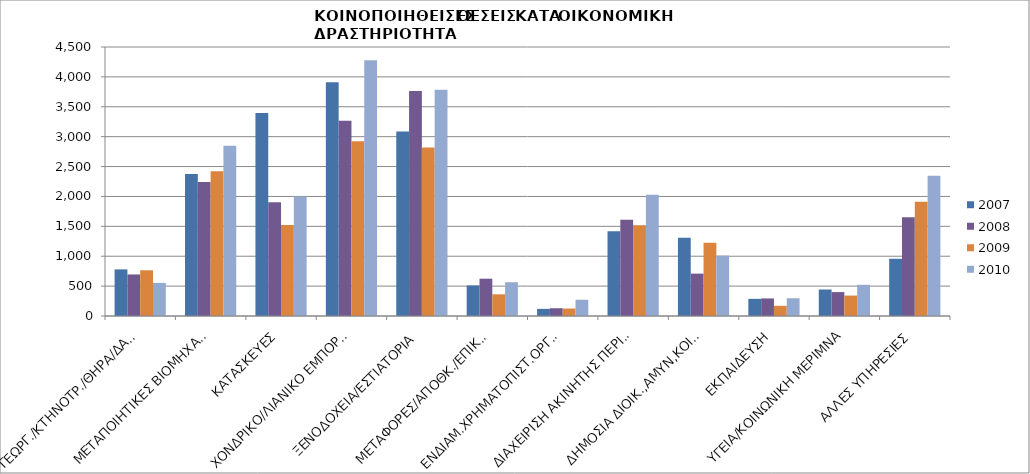
| Category | 2007 | 2008 | 2009 | 2010 |
|---|---|---|---|---|
| ΓΕΩΡΓ./ΚΤΗΝΟΤΡ./ΘΗΡΑ/ΔΑΣΟ | 780 | 695 | 765 | 554 |
| ΜΕΤΑΠΟΙΗΤΙΚΕΣ ΒΙΟΜΗΧΑΝΙΕΣ | 2376 | 2241 | 2423 | 2846 |
| ΚΑΤΑΣΚΕΥΕΣ | 3395 | 1903 | 1523 | 1999 |
| ΧΟΝΔΡΙΚΟ/ΛΙΑΝΙΚΟ ΕΜΠΟΡΙΟ | 3909 | 3267 | 2923 | 4277 |
| ΞΕΝΟΔΟΧΕΙΑ/ΕΣΤΙΑΤΟΡΙΑ | 3088 | 3762 | 2817 | 3785 |
| ΜΕΤΑΦΟΡΕΣ/ΑΠΟΘΚ./ΕΠΙΚΟΙΝ. | 511 | 624 | 363 | 565 |
| ΕΝΔΙΑΜ.ΧΡΗΜΑΤΟΠΙΣΤ.ΟΡΓΑΝ. | 119 | 130 | 125 | 272 |
| ΔΙΑΧΕΙΡΙΣΗ ΑΚΙΝΗΤΗΣ ΠΕΡΙΟΥΣ. | 1419 | 1609 | 1517 | 2030 |
| ΔΗΜΟΣΙΑ ΔΙΟΙΚ.,ΑΜΥΝ,ΚΟΙΝ.ΑΣΦ | 1311 | 709 | 1226 | 1010 |
| ΕΚΠΑΙΔΕΥΣΗ | 287 | 294 | 170 | 297 |
| ΥΓΕΙΑ/ΚΟΙΝΩΝΙΚΗ ΜΕΡΙΜΝΑ | 443 | 400 | 342 | 522 |
| ΑΛΛΕΣ ΥΠΗΡΕΣΙΕΣ | 957 | 1654 | 1910 | 2347 |